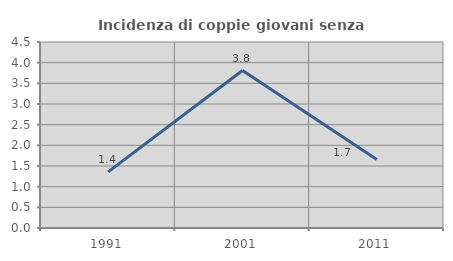
| Category | Incidenza di coppie giovani senza figli |
|---|---|
| 1991.0 | 1.357 |
| 2001.0 | 3.81 |
| 2011.0 | 1.657 |